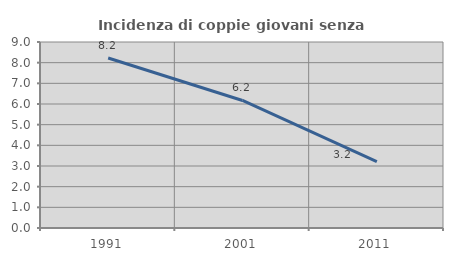
| Category | Incidenza di coppie giovani senza figli |
|---|---|
| 1991.0 | 8.227 |
| 2001.0 | 6.172 |
| 2011.0 | 3.214 |